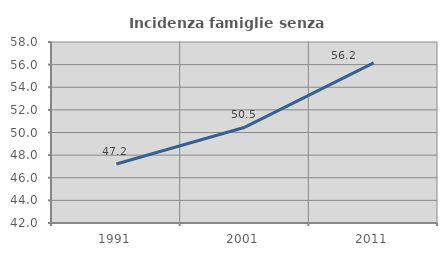
| Category | Incidenza famiglie senza nuclei |
|---|---|
| 1991.0 | 47.214 |
| 2001.0 | 50.467 |
| 2011.0 | 56.159 |